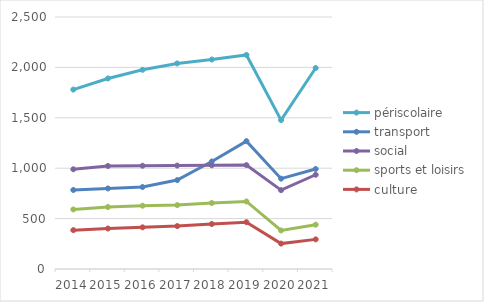
| Category | périscolaire | transport | social | sports et loisirs | culture |
|---|---|---|---|---|---|
| 2014.0 | 1780.058 | 783.8 | 989.321 | 590.775 | 385.27 |
| 2015.0 | 1890.318 | 799.119 | 1021.873 | 614.809 | 401.437 |
| 2016.0 | 1976.218 | 813.07 | 1024.503 | 627.867 | 413.201 |
| 2017.0 | 2039.465 | 881.998 | 1026.062 | 633.872 | 425.723 |
| 2018.0 | 2078.252 | 1066.604 | 1028.86 | 654.652 | 446.443 |
| 2019.0 | 2123.78 | 1268.338 | 1030.531 | 670.391 | 464.359 |
| 2020.0 | 1477.312 | 896.236 | 782.208 | 382.398 | 252.237 |
| 2021.0 | 1993.868 | 992.157 | 935 | 439.645 | 293.982 |